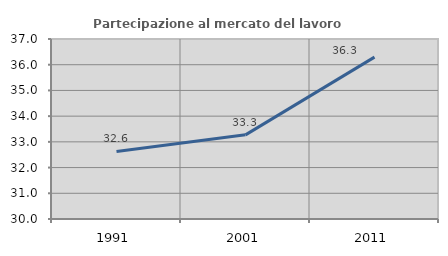
| Category | Partecipazione al mercato del lavoro  femminile |
|---|---|
| 1991.0 | 32.628 |
| 2001.0 | 33.273 |
| 2011.0 | 36.296 |